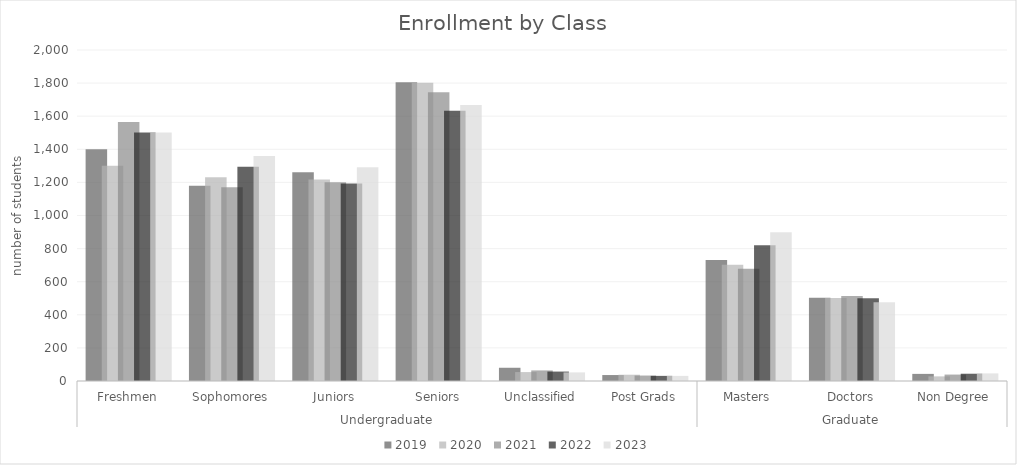
| Category | 2019  | 2020  | 2021  | 2022  | 2023  |
|---|---|---|---|---|---|
| 0 | 1401 | 1300 | 1565 | 1501 | 1501 |
| 1 | 1180 | 1231 | 1171 | 1295 | 1359 |
| 2 | 1262 | 1217 | 1201 | 1193 | 1292 |
| 3 | 1805 | 1802 | 1744 | 1633 | 1668 |
| 4 | 80 | 54 | 64 | 57 | 52 |
| 5 | 36 | 38 | 33 | 31 | 31 |
| 6 | 731 | 703 | 678 | 820 | 899 |
| 7 | 503 | 502 | 514 | 500 | 476 |
| 8 | 43 | 28 | 39 | 44 | 46 |